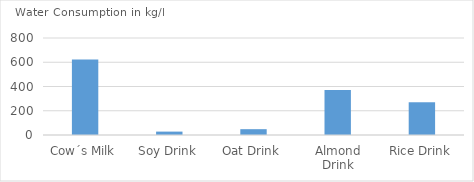
| Category | Water Consumption                in kg/L |
|---|---|
| Cow´s Milk | 623 |
| Soy Drink | 28 |
| Oat Drink | 48 |
| Almond Drink | 371 |
| Rice Drink | 270 |